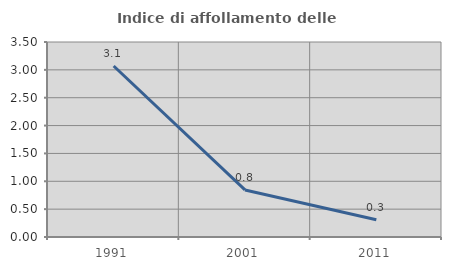
| Category | Indice di affollamento delle abitazioni  |
|---|---|
| 1991.0 | 3.069 |
| 2001.0 | 0.845 |
| 2011.0 | 0.311 |